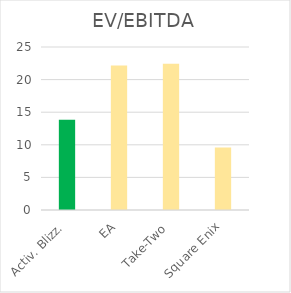
| Category | EV/EBITDA |
|---|---|
| Activ. Blizz. | 13.85 |
| EA | 22.16 |
| Take-Two | 22.42 |
| Square Enix | 9.57 |